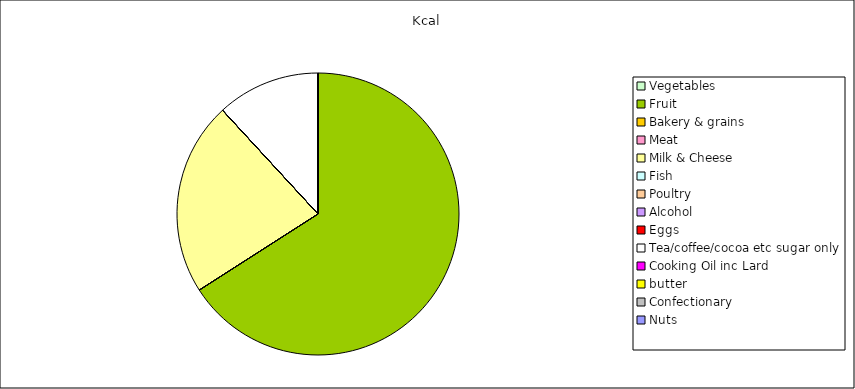
| Category | Kcal |
|---|---|
| Vegetables | 0 |
| Fruit | 89 |
| Bakery & grains | 0 |
| Meat | 0 |
| Milk & Cheese | 30 |
| Fish | 0 |
| Poultry | 0 |
| Alcohol | 0 |
| Eggs | 0 |
| Tea/coffee/cocoa etc sugar only | 16 |
| Cooking Oil inc Lard | 0 |
| butter | 0 |
| Confectionary | 0 |
| Nuts | 0 |